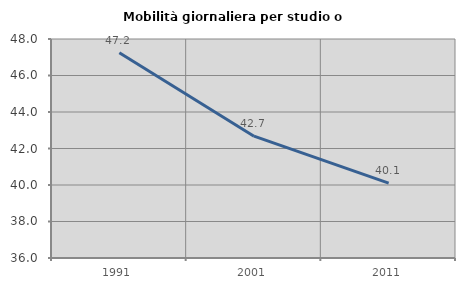
| Category | Mobilità giornaliera per studio o lavoro |
|---|---|
| 1991.0 | 47.242 |
| 2001.0 | 42.675 |
| 2011.0 | 40.106 |